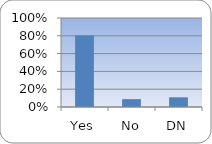
| Category | Series 0 |
|---|---|
| Yes | 0.802 |
| No | 0.088 |
| DN | 0.109 |